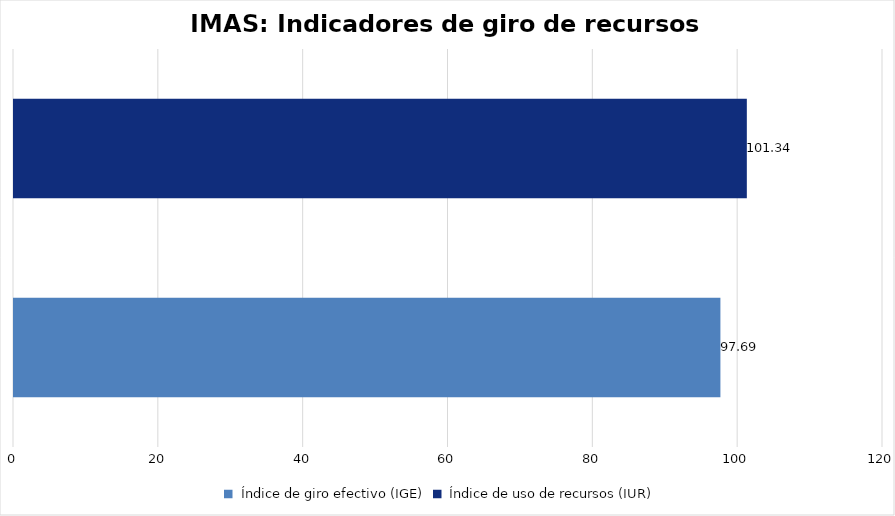
| Category | Series 0 |
|---|---|
| Índice de giro efectivo (IGE) | 97.686 |
| Índice de uso de recursos (IUR)  | 101.335 |